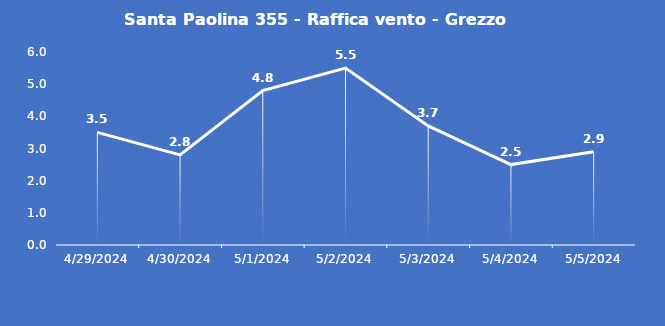
| Category | Santa Paolina 355 - Raffica vento - Grezzo (m/s) |
|---|---|
| 4/29/24 | 3.5 |
| 4/30/24 | 2.8 |
| 5/1/24 | 4.8 |
| 5/2/24 | 5.5 |
| 5/3/24 | 3.7 |
| 5/4/24 | 2.5 |
| 5/5/24 | 2.9 |